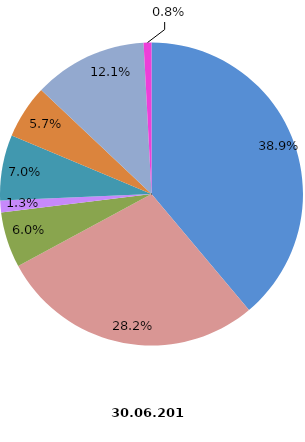
| Category | Anzahl Beschäftigte 2018 |
|---|---|
| Elektroinstallation | 5780 |
| Gas-, Wasser-, Heizungs- sowie Lüftungs- und Klimainstallation | 4199 |
| Sonstige Bauinstallation | 884 |
| Anbringen von Stuckaturen, Gipserei und Verputzerei | 187 |
| Bautischlerei und -schlosserei | 1038 |
| Fußboden-, Fliesen- und Plattenlegerei, Tapeziererei | 852 |
| Malerei und Glaserei | 1805 |
| Sonstiger Ausbau a. n. g. | 124 |